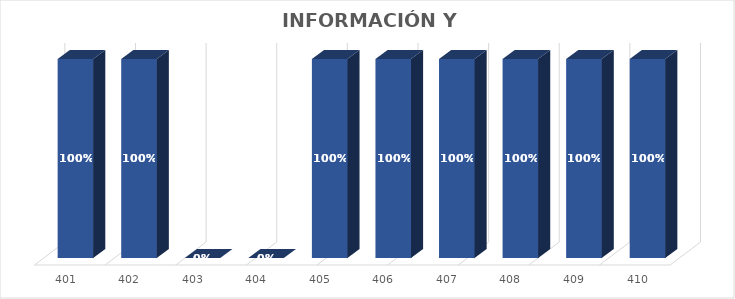
| Category | % Avance |
|---|---|
| 401.0 | 1 |
| 402.0 | 1 |
| 403.0 | 0 |
| 404.0 | 0 |
| 405.0 | 1 |
| 406.0 | 1 |
| 407.0 | 1 |
| 408.0 | 1 |
| 409.0 | 1 |
| 410.0 | 1 |